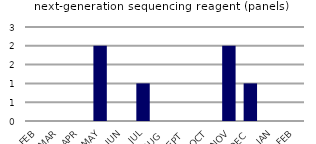
| Category | next-generation sequencing reagent (panels) |
|---|---|
| FEB | 0 |
| MAR | 0 |
| APR | 0 |
| MAY | 2 |
| JUN | 0 |
| JUL | 1 |
| AUG | 0 |
| SEPT | 0 |
| OCT | 0 |
| NOV | 2 |
| DEC | 1 |
| JAN | 0 |
| FEB | 0 |